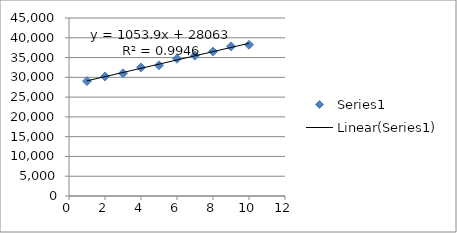
| Category | Series 0 |
|---|---|
| 1.0 | 29050 |
| 2.0 | 30219 |
| 3.0 | 31032 |
| 4.0 | 32495 |
| 5.0 | 33046 |
| 6.0 | 34708 |
| 7.0 | 35481 |
| 8.0 | 36501 |
| 9.0 | 37833 |
| 10.0 | 38232 |